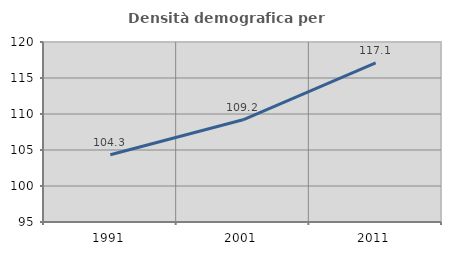
| Category | Densità demografica |
|---|---|
| 1991.0 | 104.332 |
| 2001.0 | 109.192 |
| 2011.0 | 117.087 |